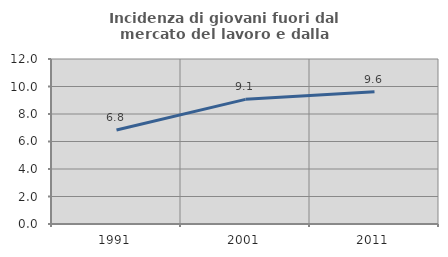
| Category | Incidenza di giovani fuori dal mercato del lavoro e dalla formazione  |
|---|---|
| 1991.0 | 6.833 |
| 2001.0 | 9.065 |
| 2011.0 | 9.624 |